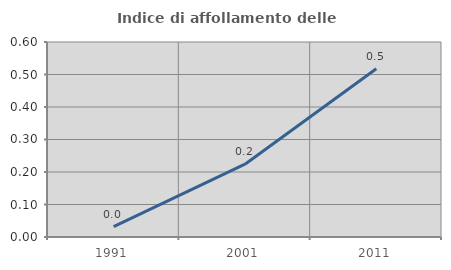
| Category | Indice di affollamento delle abitazioni  |
|---|---|
| 1991.0 | 0.032 |
| 2001.0 | 0.224 |
| 2011.0 | 0.518 |